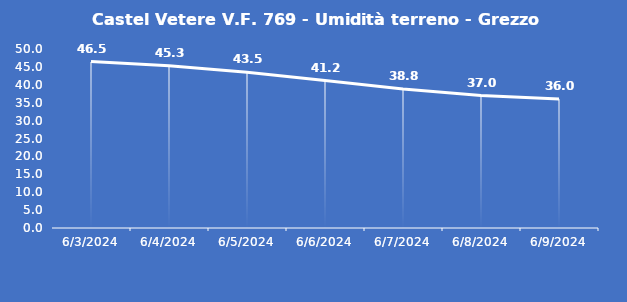
| Category | Castel Vetere V.F. 769 - Umidità terreno - Grezzo (%VWC) |
|---|---|
| 6/3/24 | 46.5 |
| 6/4/24 | 45.3 |
| 6/5/24 | 43.5 |
| 6/6/24 | 41.2 |
| 6/7/24 | 38.8 |
| 6/8/24 | 37 |
| 6/9/24 | 36 |